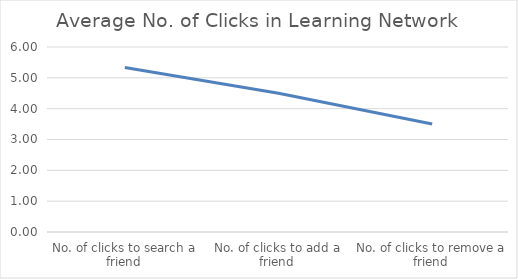
| Category | Series 0 |
|---|---|
| No. of clicks to search a friend | 5.333 |
| No. of clicks to add a friend | 4.5 |
| No. of clicks to remove a friend | 3.5 |